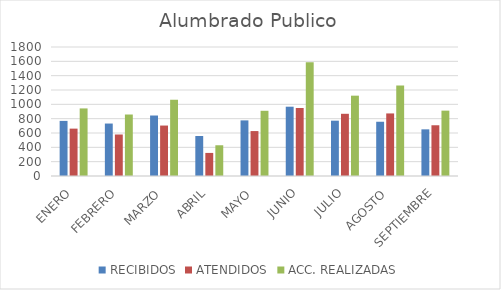
| Category | RECIBIDOS | ATENDIDOS | ACC. REALIZADAS |
|---|---|---|---|
| ENERO | 769 | 661 | 943 |
| FEBRERO | 732 | 579 | 858 |
| MARZO | 844 | 704 | 1064 |
| ABRIL | 558 | 322 | 429 |
| MAYO | 776 | 627 | 910 |
| JUNIO | 967 | 949 | 1586 |
| JULIO | 772 | 868 | 1121 |
| AGOSTO | 757 | 873 | 1262 |
| SEPTIEMBRE | 651 | 708 | 912 |